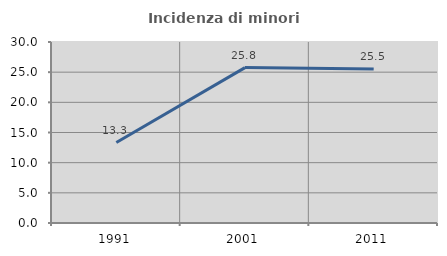
| Category | Incidenza di minori stranieri |
|---|---|
| 1991.0 | 13.333 |
| 2001.0 | 25.758 |
| 2011.0 | 25.513 |